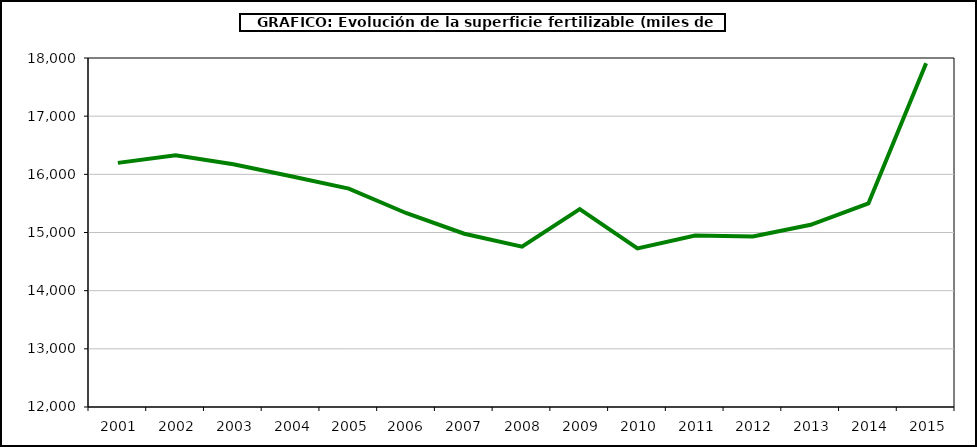
| Category | fertilizantes |
|---|---|
|   2001 | 16197 |
|   2002 | 16328 |
|   2003 | 16174 |
|   2004 | 15965.705 |
|   2005 | 15754.807 |
|   2006  | 15331.413 |
|   2007  | 14979.076 |
|   2008 | 14757 |
|   2009 | 15402 |
|   2010 | 14727 |
|   2011 | 14947 |
|   2012 | 14932 |
|   2013 | 15133 |
|   2014 | 15499 |
|   2015 | 17911 |